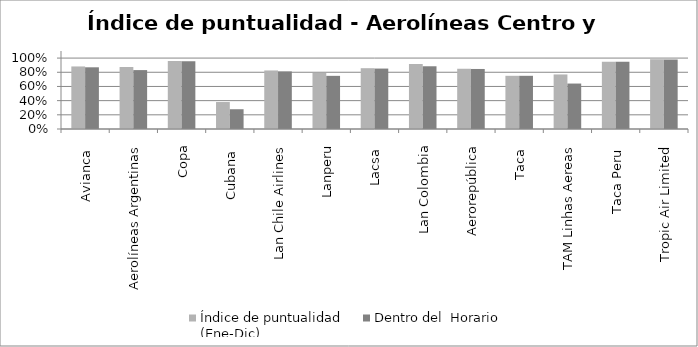
| Category | Índice de puntualidad
(Ene-Dic) | Dentro del  Horario |
|---|---|---|
| Avianca  | 0.882 | 0.87 |
| Aerolíneas Argentinas | 0.874 | 0.831 |
| Copa | 0.959 | 0.955 |
| Cubana  | 0.38 | 0.279 |
| Lan Chile Airlines | 0.826 | 0.812 |
| Lanperu | 0.79 | 0.75 |
| Lacsa  | 0.858 | 0.852 |
| Lan Colombia | 0.918 | 0.885 |
| Aerorepública | 0.85 | 0.847 |
| Taca  | 0.75 | 0.75 |
| TAM Linhas Aereas | 0.769 | 0.641 |
| Taca Peru  | 0.948 | 0.948 |
| Tropic Air Limited | 0.984 | 0.979 |